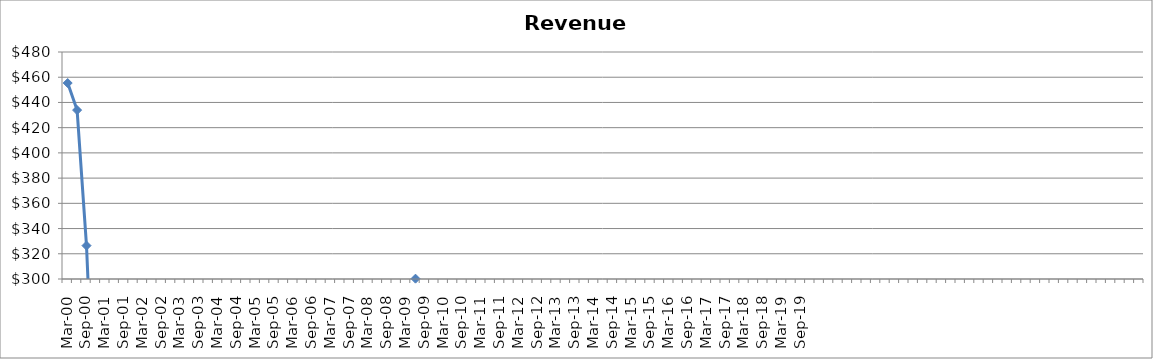
| Category | Revenue ($Millions) |
|---|---|
| Mar-00 | 455.39 |
| Jun-00 | 433.929 |
| Sep-00 | 326.471 |
| Dec-00 | 155.19 |
| Mar-01 | 107.017 |
| Jun-01 | 96.744 |
| Sep-01 | 94.331 |
| Dec-01 | 102.01 |
| Mar-02 | 107.349 |
| Jun-02 | 110.635 |
| Sep-02 | 118.934 |
| Dec-02 | 115.742 |
| Mar-03 | 136.379 |
| Jun-03 | 146.053 |
| Sep-03 | 144.77 |
| Dec-03 | 150.168 |
| Mar-04 | 156.657 |
| Jun-04 | 162.36 |
| Sep-04 | 164.183 |
| Dec-04 | 170.599 |
| Mar-05 | 162.258 |
| Jun-05 | 173.66 |
| Sep-05 | 188.175 |
| Dec-05 | 223.098 |
| Mar-06 | 218.558 |
| Jun-06 | 212.428 |
| Sep-06 | 185.941 |
| Dec-06 | 210.136 |
| Mar-07 | 245.957 |
| Jun-07 | 255.957 |
| Sep-07 | 251.816 |
| Dec-07 | 243.153 |
| Mar-08 | 204.582 |
| Jun-08 | 221.646 |
| Sep-08 | 247.35 |
| Dec-08 | 259.099 |
| Mar-09 | 263.686 |
| Jun-09 | 300.263 |
| Sep-09 | 260.064 |
| Dec-09 | 272.062 |
| Mar-10 | 270.86 |
| Jun-10 | 217.28 |
| Sep-10 | 219.951 |
| Dec-10 | 246.237 |
| Mar-11 | 231.484 |
| Jun-11 | 249.506 |
| Sep-11 | 237.104 |
| Dec-11 | 229.25 |
| Mar-12 | 243.835 |
| Jun-12 | 244.169 |
| Sep-12 | 244.84 |
| Dec-12 | 261.932 |
| Mar-13 | 274.677 |
| Jun-13 | 289.377 |
| Sep-13 | 233.884 |
| Dec-13 | 244.75 |
| Mar-14 | 195.084 |
| Jun-14 | 175.086 |
| Sep-14 | 174.017 |
| Dec-14 | 122.259 |
| Mar-15 | 106.548 |
| Jun-15 | 113.306 |
| Sep-15 | 97.548 |
| Dec-15 | 83.537 |
| Mar-16 | 69.161 |
| Jun-16 | 78.399 |
| Sep-16 | 86.17 |
| Dec-16 | 81.03 |
| Mar-17 | 93.796 |
| Jun-17 | 96.274 |
| Sep-17 | 101.781 |
| Dec-17 | 107.931 |
| Mar-18 | 101.652 |
| Jun-18 | 103.516 |
| Sep-18 | 75.104 |
| Dec-18 | 63.967 |
| Mar-19 | 64.673 |
| Jun-19 | 56.538 |
| Sep-19 | 60.681 |